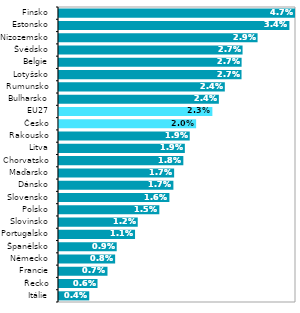
| Category | 2020* |
|---|---|
| Itálie | 0.004 |
| Řecko | 0.006 |
| Francie | 0.007 |
| Německo | 0.008 |
| Španělsko | 0.009 |
| Portugalsko | 0.011 |
| Slovinsko | 0.012 |
| Polsko | 0.015 |
| Slovensko | 0.016 |
| Dánsko | 0.017 |
| Maďarsko | 0.017 |
| Chorvatsko | 0.018 |
| Litva | 0.019 |
| Rakousko | 0.019 |
| Česko | 0.02 |
| EU27 | 0.023 |
| Bulharsko | 0.024 |
| Rumunsko | 0.024 |
| Lotyšsko | 0.027 |
| Belgie | 0.027 |
| Švédsko | 0.027 |
| Nizozemsko | 0.029 |
| Estonsko | 0.034 |
| Finsko | 0.047 |